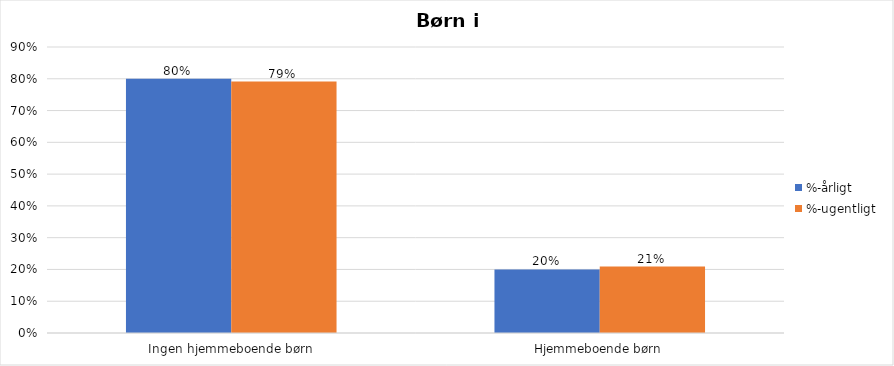
| Category | %-årligt | %-ugentligt |
|---|---|---|
| Ingen hjemmeboende børn | 0.8 | 0.791 |
| Hjemmeboende børn | 0.2 | 0.209 |